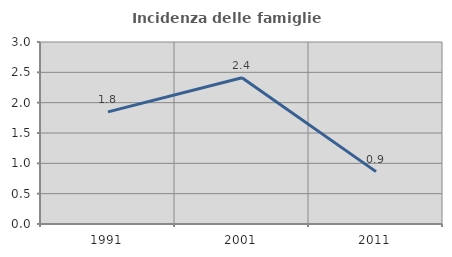
| Category | Incidenza delle famiglie numerose |
|---|---|
| 1991.0 | 1.848 |
| 2001.0 | 2.412 |
| 2011.0 | 0.864 |